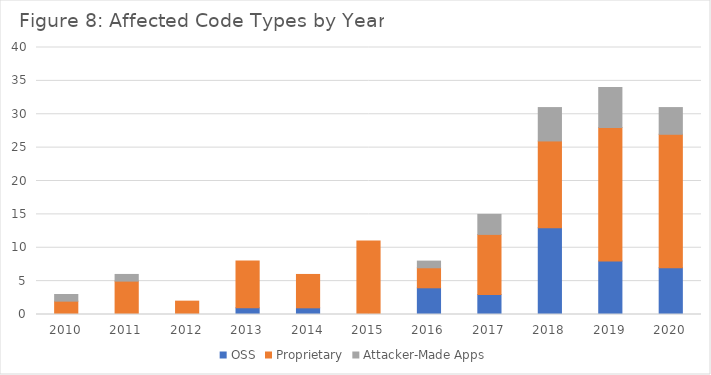
| Category | OSS | Proprietary | Attacker-Made Apps |
|---|---|---|---|
| 2010.0 | 0 | 2 | 1 |
| 2011.0 | 0 | 5 | 1 |
| 2012.0 | 0 | 2 | 0 |
| 2013.0 | 1 | 7 | 0 |
| 2014.0 | 1 | 5 | 0 |
| 2015.0 | 0 | 11 | 0 |
| 2016.0 | 4 | 3 | 1 |
| 2017.0 | 3 | 9 | 3 |
| 2018.0 | 13 | 13 | 5 |
| 2019.0 | 8 | 20 | 6 |
| 2020.0 | 7 | 20 | 4 |